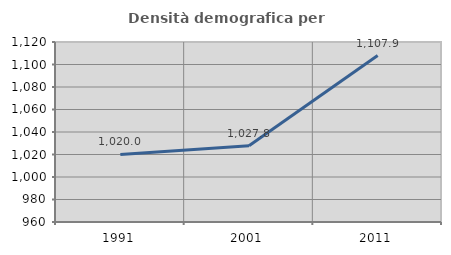
| Category | Densità demografica |
|---|---|
| 1991.0 | 1020.004 |
| 2001.0 | 1027.802 |
| 2011.0 | 1107.931 |